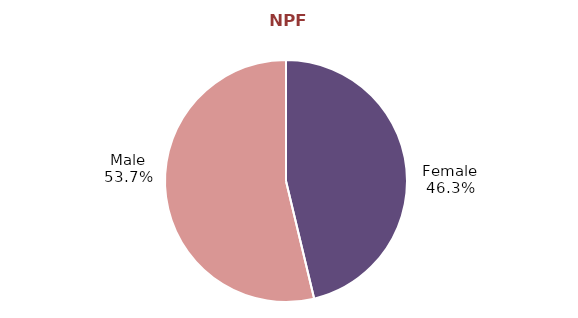
| Category | Series 0 |
|---|---|
| Female | 42272307.6 |
| Male | 49111751.43 |